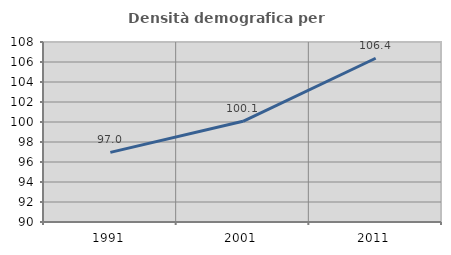
| Category | Densità demografica |
|---|---|
| 1991.0 | 96.963 |
| 2001.0 | 100.071 |
| 2011.0 | 106.373 |